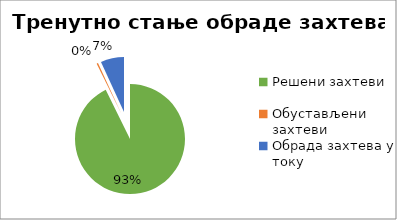
| Category | Series 0 |
|---|---|
| Решени захтеви | 39360 |
| Обустављени захтеви | 173 |
| Обрада захтева у току | 2918 |